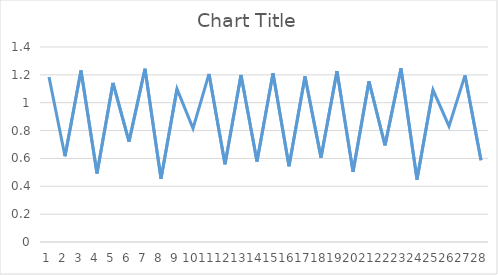
| Category | Series 0 |
|---|---|
| 0 | 1.185 |
| 1 | 0.616 |
| 2 | 1.231 |
| 3 | 0.492 |
| 4 | 1.142 |
| 5 | 0.721 |
| 6 | 1.244 |
| 7 | 0.455 |
| 8 | 1.099 |
| 9 | 0.815 |
| 10 | 1.207 |
| 11 | 0.558 |
| 12 | 1.199 |
| 13 | 0.578 |
| 14 | 1.212 |
| 15 | 0.543 |
| 16 | 1.188 |
| 17 | 0.606 |
| 18 | 1.227 |
| 19 | 0.503 |
| 20 | 1.153 |
| 21 | 0.693 |
| 22 | 1.246 |
| 23 | 0.449 |
| 24 | 1.092 |
| 25 | 0.831 |
| 26 | 1.196 |
| 27 | 0.587 |